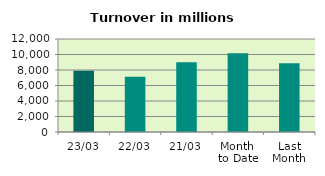
| Category | Series 0 |
|---|---|
| 23/03 | 7890.673 |
| 22/03 | 7116.953 |
| 21/03 | 8996.242 |
| Month 
to Date | 10157.475 |
| Last
Month | 8884.685 |